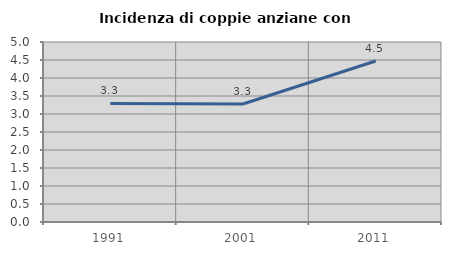
| Category | Incidenza di coppie anziane con figli |
|---|---|
| 1991.0 | 3.292 |
| 2001.0 | 3.279 |
| 2011.0 | 4.472 |